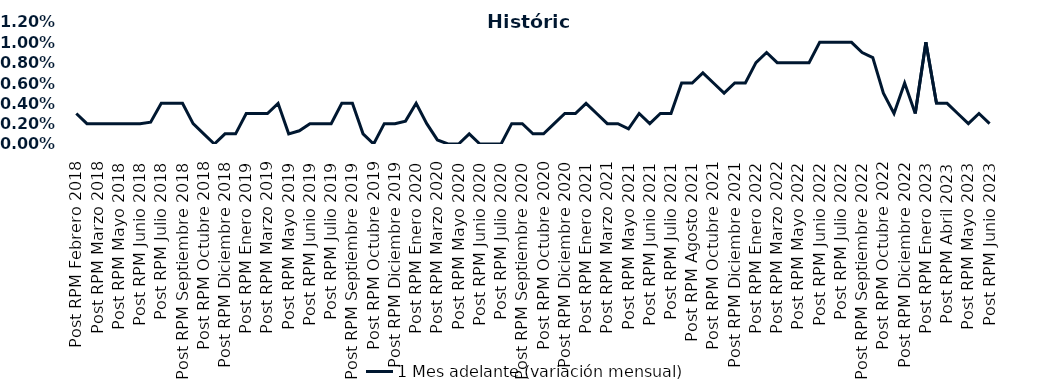
| Category | 1 Mes adelante (variación mensual) |
|---|---|
| Post RPM Febrero 2018 | 0.003 |
| Pre RPM Marzo 2018 | 0.002 |
| Post RPM Marzo 2018 | 0.002 |
| Pre RPM Mayo 2018 | 0.002 |
| Post RPM Mayo 2018 | 0.002 |
| Pre RPM Junio 2018 | 0.002 |
| Post RPM Junio 2018 | 0.002 |
| Pre RPM Julio 2018 | 0.002 |
| Post RPM Julio 2018 | 0.004 |
| Pre RPM Septiembre 2018 | 0.004 |
| Post RPM Septiembre 2018 | 0.004 |
| Pre RPM Octubre 2018 | 0.002 |
| Post RPM Octubre 2018 | 0.001 |
| Pre RPM Diciembre 2018 | 0 |
| Post RPM Diciembre 2018 | 0.001 |
| Pre RPM Enero 2019 | 0.001 |
| Post RPM Enero 2019 | 0.003 |
| Pre RPM Marzo 2019 | 0.003 |
| Post RPM Marzo 2019 | 0.003 |
| Pre RPM Mayo 2019 | 0.004 |
| Post RPM Mayo 2019 | 0.001 |
| Pre RPM Junio 2019 | 0.001 |
| Post RPM Junio 2019 | 0.002 |
| Pre RPM Julio 2019 | 0.002 |
| Post RPM Julio 2019 | 0.002 |
| Pre RPM Septiembre 2019 | 0.004 |
| Post RPM Septiembre 2019 | 0.004 |
| Pre RPM Octubre 2019 | 0.001 |
| Post RPM Octubre 2019 | 0 |
| Pre RPM Diciembre 2019 | 0.002 |
| Post RPM Diciembre 2019 | 0.002 |
| Pre RPM Enero 2020 | 0.002 |
| Post RPM Enero 2020 | 0.004 |
| Pre RPM Marzo 2020 | 0.002 |
| Post RPM Marzo 2020 | 0 |
| Pre RPM Mayo 2020 | 0 |
| Post RPM Mayo 2020 | 0 |
| Pre RPM Junio 2020 | 0.001 |
| Post RPM Junio 2020 | 0 |
| Pre RPM Julio 2020 | 0 |
| Post RPM Julio 2020 | 0 |
| Pre RPM Septiembre 2020 | 0.002 |
| Post RPM Septiembre 2020 | 0.002 |
| Pre RPM Octubre 2020 | 0.001 |
| Post RPM Octubre 2020 | 0.001 |
| Pre RPM Diciembre 2020 | 0.002 |
| Post RPM Diciembre 2020 | 0.003 |
| Pre RPM Enero 2021 | 0.003 |
| Post RPM Enero 2021 | 0.004 |
| Pre RPM Marzo 2021 | 0.003 |
| Post RPM Marzo 2021 | 0.002 |
| Pre RPM Mayo 2021 | 0.002 |
| Post RPM Mayo 2021 | 0.002 |
| Pre RPM Junio 2021 | 0.003 |
| Post RPM Junio 2021 | 0.002 |
| Pre RPM Julio 2021 | 0.003 |
| Post RPM Julio 2021 | 0.003 |
| Pre RPM Agosto 2021 | 0.006 |
| Post RPM Agosto 2021 | 0.006 |
| Pre RPM Octubre 2021 | 0.007 |
| Post RPM Octubre 2021 | 0.006 |
| Pre RPM Diciembre 2021 | 0.005 |
| Post RPM Diciembre 2021 | 0.006 |
| Pre RPM Enero 2022 | 0.006 |
| Post RPM Enero 2022 | 0.008 |
| Pre RPM Marzo 2022 | 0.009 |
| Post RPM Marzo 2022 | 0.008 |
| Pre RPM Mayo 2022 | 0.008 |
| Post RPM Mayo 2022 | 0.008 |
| Pre RPM Junio 2022 | 0.008 |
| Post RPM Junio 2022 | 0.01 |
| Pre RPM Julio 2022 | 0.01 |
| Post RPM Julio 2022 | 0.01 |
| Pre RPM Septiembre 2022 | 0.01 |
| Post RPM Septiembre 2022 | 0.009 |
| Pre RPM Octubre 2022 | 0.008 |
| Post RPM Octubre 2022 | 0.005 |
| Pre RPM Diciembre 2022 | 0.003 |
| Post RPM Diciembre 2022 | 0.006 |
| Pre RPM Enero 2023 | 0.003 |
| Post RPM Enero 2023 | 0.01 |
| Pre RPM Abril 2023 | 0.004 |
| Post RPM Abril 2023 | 0.004 |
| Pre RPM Mayo 2023 | 0.003 |
| Post RPM Mayo 2023 | 0.002 |
| Pre RPM Junio 2023 | 0.003 |
| Post RPM Junio 2023 | 0.002 |